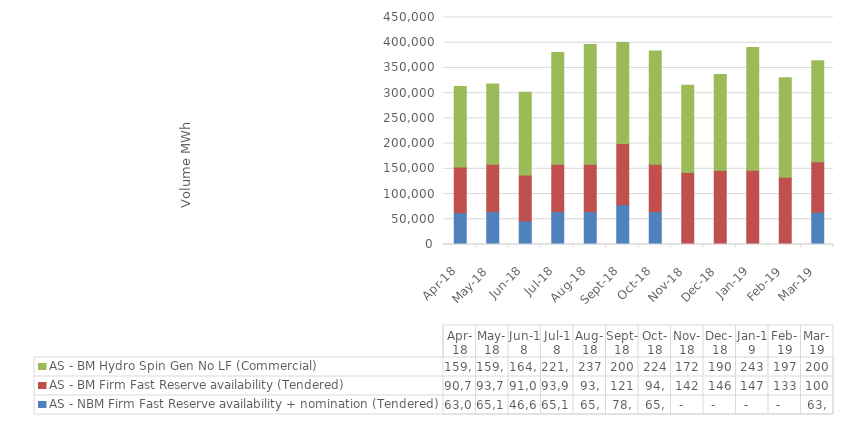
| Category | AS - NBM Firm Fast Reserve availability + nomination (Tendered) | AS - BM Firm Fast Reserve availability (Tendered) | AS - BM Hydro Spin Gen No LF (Commercial) |
|---|---|---|---|
| 2018-04-01 | 63000 | 90720 | 159712.75 |
| 2018-05-01 | 65100 | 93780 | 159528.13 |
| 2018-06-01 | 46620 | 91080 | 164254.81 |
| 2018-07-01 | 65100 | 93960 | 221511.75 |
| 2018-08-01 | 65100 | 93960 | 237260.01 |
| 2018-09-01 | 78552 | 121800 | 200063.52 |
| 2018-10-01 | 65100 | 94140 | 224153.54 |
| 2018-11-01 | 0 | 142780 | 172819.75 |
| 2018-12-01 | 0 | 146650 | 190132.75 |
| 2019-01-01 | 0 | 147310 | 243344.56 |
| 2019-02-01 | 0 | 133160 | 197601.24 |
| 2019-03-01 | 63900 | 100230 | 200007.52 |